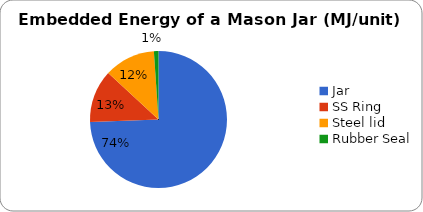
| Category | Energy (MJ/Unit) |
|---|---|
| Jar | 3.154 |
| SS Ring | 0.527 |
| Steel lid | 0.51 |
| Rubber Seal | 0.046 |